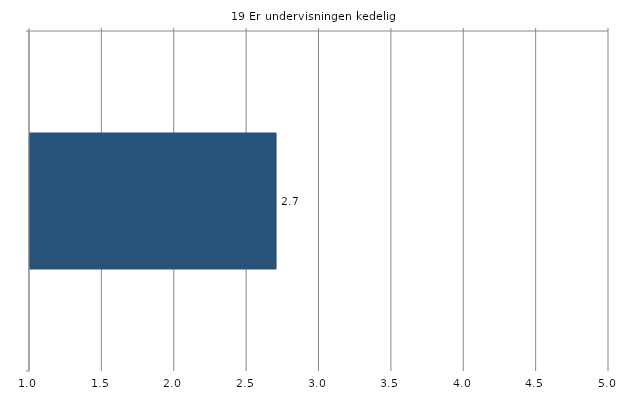
| Category | Gns. |
|---|---|
|    | 2.7 |